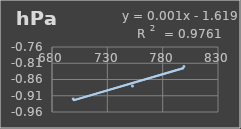
| Category | Presión Atmosférica |
|---|---|
| 699.2 | -0.92 |
| 752.7 | -0.88 |
| 799.2 | -0.82 |